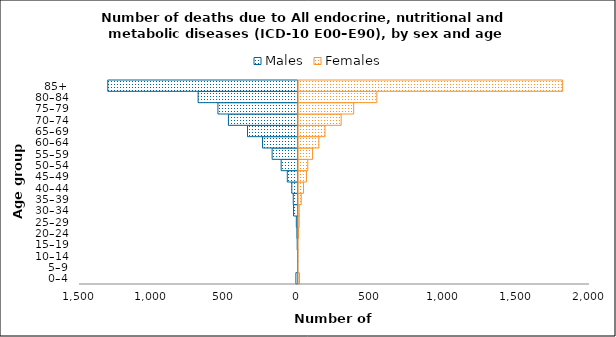
| Category | Males | Females |
|---|---|---|
| 0–4 | -15 | 13 |
| 5–9 | -2 | 1 |
| 10–14 | -2 | 2 |
| 15–19 | -6 | 3 |
| 20–24 | -8 | 6 |
| 25–29 | -12 | 11 |
| 30–34 | -31 | 11 |
| 35–39 | -33 | 25 |
| 40–44 | -43 | 41 |
| 45–49 | -74 | 61 |
| 50–54 | -116 | 70 |
| 55–59 | -178 | 103 |
| 60–64 | -244 | 146 |
| 65–69 | -347 | 188 |
| 70–74 | -478 | 299 |
| 75–79 | -550 | 385 |
| 80–84 | -686 | 544 |
| 85+ | -1306 | 1819 |